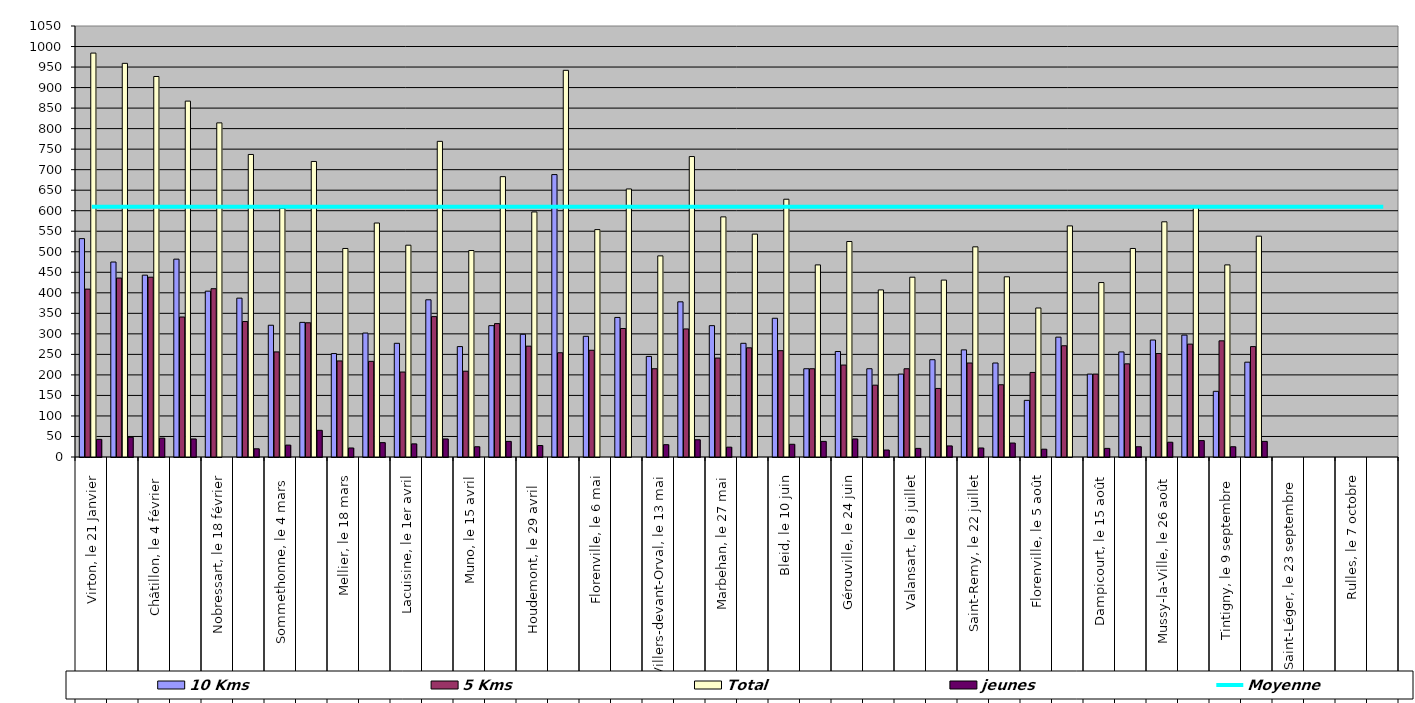
| Category | 10 Kms | 5 Kms | Total | jeunes |
|---|---|---|---|---|
| 0 | 532 | 409 | 984 | 43 |
| 1 | 475 | 436 | 959 | 48 |
| 2 | 443 | 438 | 927 | 46 |
| 3 | 482 | 341 | 867 | 44 |
| 4 | 404 | 410 | 814 | 0 |
| 5 | 387 | 330 | 737 | 20 |
| 6 | 321 | 256 | 606 | 29 |
| 7 | 328 | 327 | 720 | 65 |
| 8 | 252 | 234 | 508 | 22 |
| 9 | 302 | 233 | 570 | 35 |
| 10 | 277 | 207 | 516 | 32 |
| 11 | 383 | 342 | 769 | 44 |
| 12 | 269 | 209 | 503 | 25 |
| 13 | 320 | 325 | 683 | 38 |
| 14 | 299 | 270 | 597 | 28 |
| 15 | 688 | 254 | 942 | 0 |
| 16 | 294 | 260 | 554 | 0 |
| 17 | 340 | 313 | 653 | 0 |
| 18 | 245 | 215 | 490 | 30 |
| 19 | 378 | 312 | 732 | 42 |
| 20 | 320 | 241 | 585 | 24 |
| 21 | 277 | 266 | 543 | 0 |
| 22 | 338 | 259 | 628 | 31 |
| 23 | 215 | 215 | 468 | 38 |
| 24 | 257 | 224 | 525 | 44 |
| 25 | 215 | 175 | 407 | 17 |
| 26 | 202 | 215 | 438 | 21 |
| 27 | 237 | 167 | 431 | 27 |
| 28 | 261 | 229 | 512 | 22 |
| 29 | 229 | 176 | 439 | 34 |
| 30 | 138 | 206 | 363 | 19 |
| 31 | 292 | 271 | 563 | 0 |
| 32 | 202 | 202 | 425 | 21 |
| 33 | 256 | 227 | 508 | 25 |
| 34 | 285 | 252 | 573 | 36 |
| 35 | 297 | 275 | 612 | 40 |
| 36 | 160 | 283 | 468 | 25 |
| 37 | 231 | 269 | 538 | 38 |
| 38 | 0 | 0 | 0 | 0 |
| 39 | 0 | 0 | 0 | 0 |
| 40 | 0 | 0 | 0 | 0 |
| 41 | 0 | 0 | 0 | 0 |